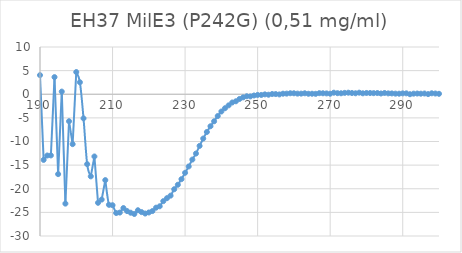
| Category | Series 0 |
|---|---|
| 300.0 | 0.094 |
| 299.0 | 0.153 |
| 298.0 | 0.201 |
| 297.0 | 0.034 |
| 296.0 | 0.155 |
| 295.0 | 0.119 |
| 294.0 | 0.15 |
| 293.0 | 0.125 |
| 292.0 | 0.005 |
| 291.0 | 0.192 |
| 290.0 | 0.183 |
| 289.0 | 0.118 |
| 288.0 | 0.126 |
| 287.0 | 0.174 |
| 286.0 | 0.183 |
| 285.0 | 0.267 |
| 284.0 | 0.162 |
| 283.0 | 0.257 |
| 282.0 | 0.23 |
| 281.0 | 0.256 |
| 280.0 | 0.27 |
| 279.0 | 0.199 |
| 278.0 | 0.332 |
| 277.0 | 0.205 |
| 276.0 | 0.26 |
| 275.0 | 0.33 |
| 274.0 | 0.291 |
| 273.0 | 0.204 |
| 272.0 | 0.227 |
| 271.0 | 0.327 |
| 270.0 | 0.116 |
| 269.0 | 0.178 |
| 268.0 | 0.205 |
| 267.0 | 0.228 |
| 266.0 | 0.09 |
| 265.0 | 0.112 |
| 264.0 | 0.102 |
| 263.0 | 0.203 |
| 262.0 | 0.132 |
| 261.0 | 0.134 |
| 260.0 | 0.204 |
| 259.0 | 0.21 |
| 258.0 | 0.132 |
| 257.0 | 0.12 |
| 256.0 | -0.036 |
| 255.0 | 0.039 |
| 254.0 | 0.049 |
| 253.0 | -0.098 |
| 252.0 | -0.028 |
| 251.0 | -0.147 |
| 250.0 | -0.149 |
| 249.0 | -0.263 |
| 248.0 | -0.453 |
| 247.0 | -0.425 |
| 246.0 | -0.662 |
| 245.0 | -0.998 |
| 244.0 | -1.489 |
| 243.0 | -1.747 |
| 242.0 | -2.354 |
| 241.0 | -2.961 |
| 240.0 | -3.653 |
| 239.0 | -4.62 |
| 238.0 | -5.724 |
| 237.0 | -6.774 |
| 236.0 | -7.99 |
| 235.0 | -9.378 |
| 234.0 | -10.928 |
| 233.0 | -12.545 |
| 232.0 | -13.823 |
| 231.0 | -15.279 |
| 230.0 | -16.623 |
| 229.0 | -17.968 |
| 228.0 | -19.155 |
| 227.0 | -20.099 |
| 226.0 | -21.46 |
| 225.0 | -21.996 |
| 224.0 | -22.62 |
| 223.0 | -23.711 |
| 222.0 | -24.004 |
| 221.0 | -24.721 |
| 220.0 | -25.023 |
| 219.0 | -25.24 |
| 218.0 | -24.943 |
| 217.0 | -24.549 |
| 216.0 | -25.34 |
| 215.0 | -25.074 |
| 214.0 | -24.722 |
| 213.0 | -24.085 |
| 212.0 | -25.041 |
| 211.0 | -25.136 |
| 210.0 | -23.486 |
| 209.0 | -23.394 |
| 208.0 | -18.17 |
| 207.0 | -22.292 |
| 206.0 | -22.973 |
| 205.0 | -13.169 |
| 204.0 | -17.377 |
| 203.0 | -14.792 |
| 202.0 | -5.1 |
| 201.0 | 2.538 |
| 200.0 | 4.697 |
| 199.0 | -10.56 |
| 198.0 | -5.711 |
| 197.0 | -23.148 |
| 196.0 | 0.564 |
| 195.0 | -16.903 |
| 194.0 | 3.629 |
| 193.0 | -12.947 |
| 192.0 | -12.964 |
| 191.0 | -13.895 |
| 190.0 | 4.045 |